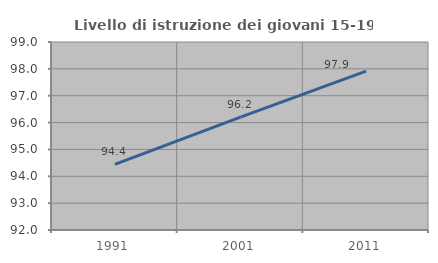
| Category | Livello di istruzione dei giovani 15-19 anni |
|---|---|
| 1991.0 | 94.444 |
| 2001.0 | 96.203 |
| 2011.0 | 97.917 |